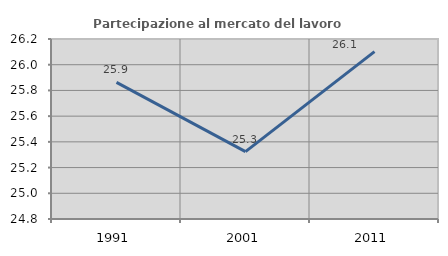
| Category | Partecipazione al mercato del lavoro  femminile |
|---|---|
| 1991.0 | 25.863 |
| 2001.0 | 25.324 |
| 2011.0 | 26.102 |